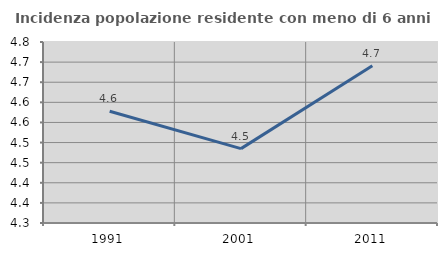
| Category | Incidenza popolazione residente con meno di 6 anni |
|---|---|
| 1991.0 | 4.578 |
| 2001.0 | 4.485 |
| 2011.0 | 4.691 |